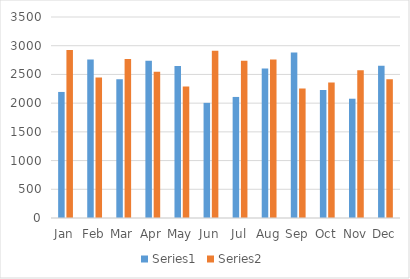
| Category | Series 0 | Series 1 |
|---|---|---|
| Jan | 2195 | 2925 |
| Feb | 2760 | 2447 |
| Mar | 2415 | 2768 |
| Apr | 2738 | 2547 |
| May | 2647 | 2289 |
| Jun | 2005 | 2911 |
| Jul | 2108 | 2738 |
| Aug | 2604 | 2759 |
| Sep | 2883 | 2254 |
| Oct | 2231 | 2360 |
| Nov | 2077 | 2573 |
| Dec | 2650 | 2414 |